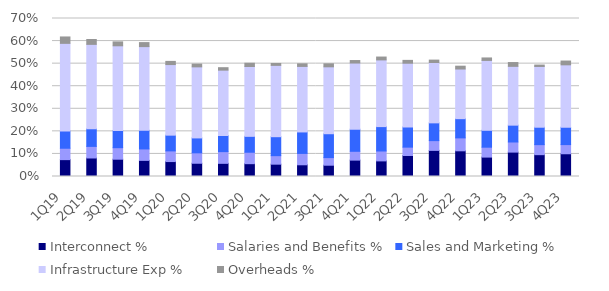
| Category | Interconnect % | Salaries and Benefits % | Sales and Marketing % | Infrastructure Exp % | Overheads % |
|---|---|---|---|---|---|
| 1Q19 | 0.075 | 0.05 | 0.077 | 0.388 | 0.028 |
| 2Q19 | 0.082 | 0.051 | 0.078 | 0.374 | 0.022 |
| 3Q19 | 0.077 | 0.051 | 0.076 | 0.375 | 0.017 |
| 4Q19 | 0.071 | 0.051 | 0.083 | 0.371 | 0.018 |
| 1Q20 | 0.066 | 0.047 | 0.07 | 0.313 | 0.014 |
| 2Q20 | 0.059 | 0.046 | 0.066 | 0.315 | 0.012 |
| 3Q20 | 0.058 | 0.052 | 0.071 | 0.29 | 0.011 |
| 4Q20 | 0.057 | 0.051 | 0.07 | 0.309 | 0.014 |
| 1Q21 | 0.055 | 0.038 | 0.084 | 0.316 | 0.008 |
| 2Q21 | 0.052 | 0.05 | 0.095 | 0.29 | 0.011 |
| 3Q21 | 0.05 | 0.034 | 0.106 | 0.296 | 0.013 |
| 4Q21 | 0.073 | 0.039 | 0.098 | 0.293 | 0.011 |
| 1Q22 | 0.069 | 0.044 | 0.108 | 0.295 | 0.013 |
| 2Q22 | 0.093 | 0.037 | 0.089 | 0.282 | 0.013 |
| 3Q22 | 0.116 | 0.043 | 0.079 | 0.267 | 0.011 |
| 4Q22 | 0.114 | 0.057 | 0.085 | 0.22 | 0.013 |
| 1Q23 | 0.086 | 0.044 | 0.075 | 0.31 | 0.011 |
| 2Q23 | 0.108 | 0.045 | 0.075 | 0.261 | 0.017 |
| 3Q23 | 0.097 | 0.044 | 0.077 | 0.269 | 0.006 |
| 4Q23 | 0.101 | 0.041 | 0.077 | 0.277 | 0.017 |